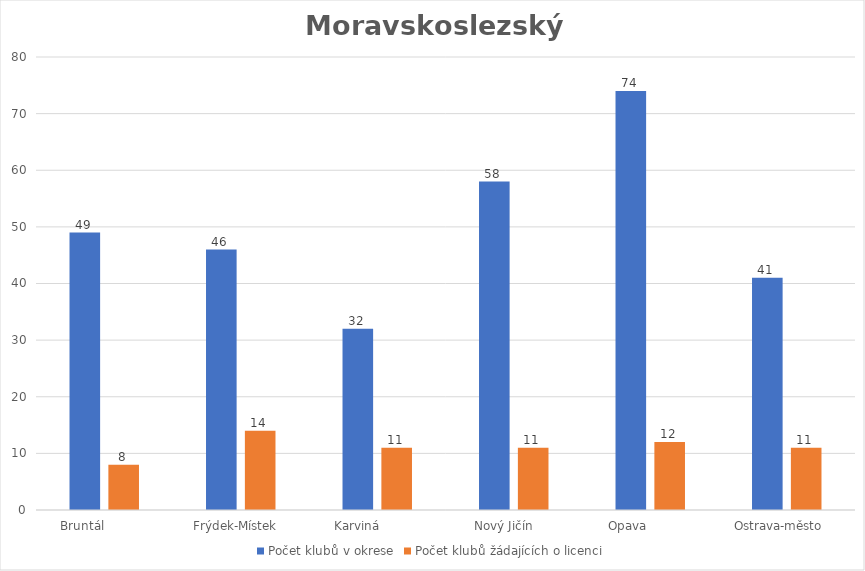
| Category | Počet klubů v okrese | Počet klubů žádajících o licenci |
|---|---|---|
| Bruntál            | 49 | 8 |
| Frýdek-Místek   | 46 | 14 |
| Karviná           | 32 | 11 |
| Nový Jičín     | 58 | 11 |
| Opava            | 74 | 12 |
| Ostrava-město    | 41 | 11 |